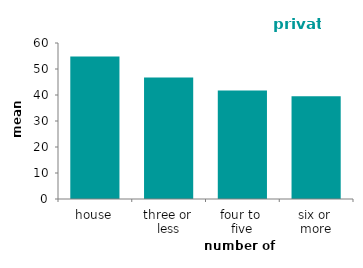
| Category | private |
|---|---|
| house | 54.772 |
| three or 
less | 46.706 |
| four to 
five | 41.763 |
| six or 
more | 39.486 |